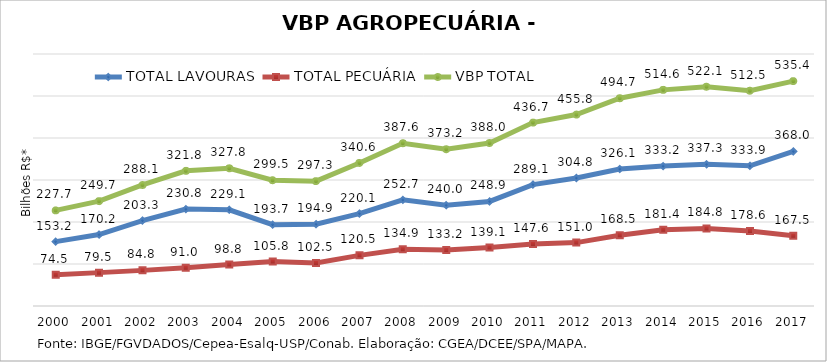
| Category | TOTAL LAVOURAS | TOTAL PECUÁRIA | VBP TOTAL |
|---|---|---|---|
| 2000 | 153.228 | 74.482 | 227.71 |
| 2001 | 170.208 | 79.463 | 249.671 |
| 2002 | 203.319 | 84.827 | 288.146 |
| 2003 | 230.765 | 91.048 | 321.813 |
| 2004 | 229.076 | 98.761 | 327.836 |
| 2005 | 193.673 | 105.797 | 299.47 |
| 2006 | 194.856 | 102.465 | 297.321 |
| 2007 | 220.055 | 120.545 | 340.599 |
| 2008 | 252.677 | 134.918 | 387.595 |
| 2009 | 240.01 | 133.163 | 373.173 |
| 2010 | 248.917 | 139.13 | 388.047 |
| 2011 | 289.086 | 147.581 | 436.667 |
| 2012 | 304.806 | 150.967 | 455.773 |
| 2013 | 326.129 | 168.536 | 494.665 |
| 2014 | 333.192 | 181.393 | 514.585 |
| 2015 | 337.297 | 184.79 | 522.086 |
| 2016 | 333.899 | 178.646 | 512.545 |
| 2017 | 367.979 | 167.457 | 535.435 |